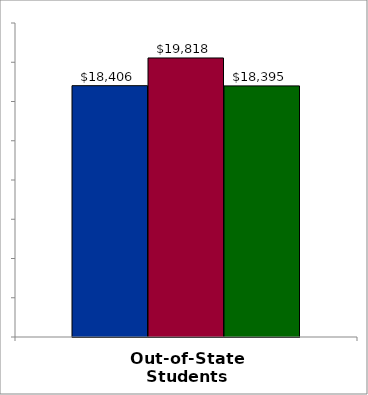
| Category | 50 states and D.C. | SREB states | State |
|---|---|---|---|
| Out-of-State Students | 18406 | 19818 | 18395 |